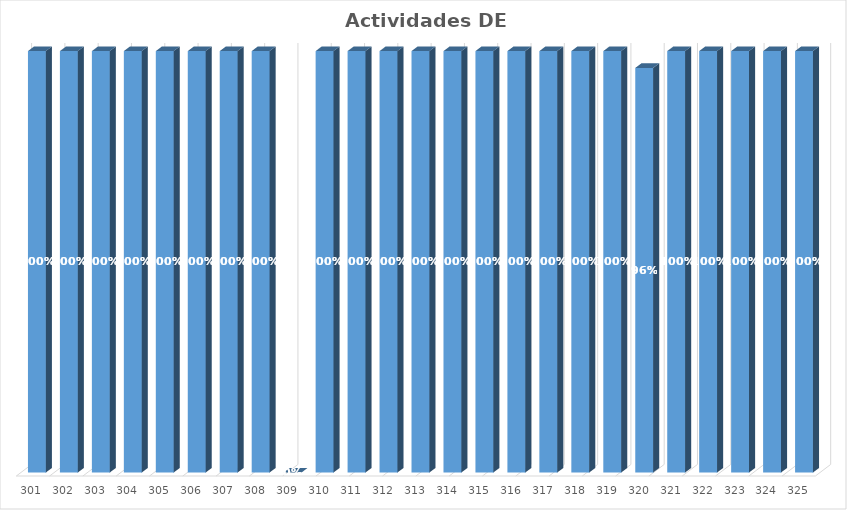
| Category | % Avance |
|---|---|
| 301.0 | 1 |
| 302.0 | 1 |
| 303.0 | 1 |
| 304.0 | 1 |
| 305.0 | 1 |
| 306.0 | 1 |
| 307.0 | 1 |
| 308.0 | 1 |
| 309.0 | 0 |
| 310.0 | 1 |
| 311.0 | 1 |
| 312.0 | 1 |
| 313.0 | 1 |
| 314.0 | 1 |
| 315.0 | 1 |
| 316.0 | 1 |
| 317.0 | 1 |
| 318.0 | 1 |
| 319.0 | 1 |
| 320.0 | 0.96 |
| 321.0 | 1 |
| 322.0 | 1 |
| 323.0 | 1 |
| 324.0 | 1 |
| 325.0 | 1 |